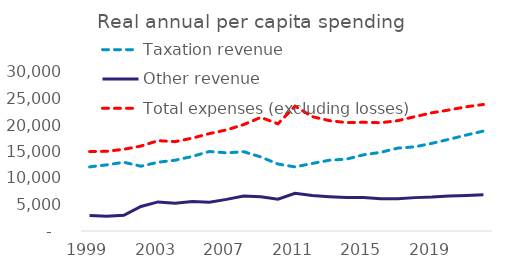
| Category |  Taxation revenue  |  Other revenue  |  Total expenses (excluding losses)  |
|---|---|---|---|
| 1999-06-01 | 12094.03 | 2937.218 | 14983.107 |
| 2000-06-01 | 12476.215 | 2777.328 | 15035.955 |
| 2001-06-01 | 12967.657 | 2952.651 | 15418.514 |
| 2002-06-01 | 12226.856 | 4636.401 | 16028.929 |
| 2003-06-01 | 12977.754 | 5488.435 | 17042.044 |
| 2004-06-01 | 13352.957 | 5255.186 | 16858.458 |
| 2005-06-01 | 14072.7 | 5586.039 | 17523.567 |
| 2006-06-01 | 15000.896 | 5413.525 | 18380.98 |
| 2007-06-01 | 14744.807 | 5963.6 | 19076.223 |
| 2008-06-01 | 14967.36 | 6601.388 | 20072.065 |
| 2009-06-01 | 13969.599 | 6468.148 | 21442.154 |
| 2010-06-01 | 12635.75 | 6003.029 | 20223.674 |
| 2011-06-01 | 12095.926 | 7117.31 | 23565.385 |
| 2012-06-01 | 12741.136 | 6684.872 | 21579.636 |
| 2013-06-01 | 13354.136 | 6472.623 | 20826.471 |
| 2014-06-01 | 13556.081 | 6306.086 | 20450.691 |
| 2015-06-01 | 14373.062 | 6301.039 | 20512.865 |
| 2016-06-01 | 14845.088 | 6070.957 | 20430.428 |
| 2017-06-01 | 15639.25 | 6102.338 | 20820.626 |
| 2018-06-01 | 15882.58 | 6297.43 | 21573.353 |
| 2019-06-01 | 16546.823 | 6419.494 | 22309.929 |
| 2020-06-01 | 17308.27 | 6614.264 | 22837.361 |
| 2021-06-01 | 18106.535 | 6707.332 | 23440.09 |
| 2022-06-01 | 18856.962 | 6821.989 | 23870.838 |